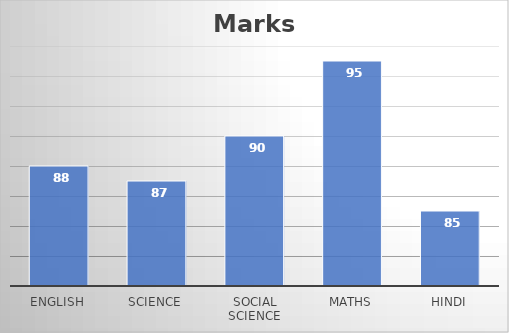
| Category | Marks obtained |
|---|---|
| English | 88 |
| Science | 87 |
| Social Science | 90 |
| Maths | 95 |
| Hindi | 85 |